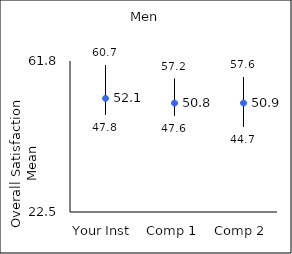
| Category | 25th percentile | 75th percentile | Mean |
|---|---|---|---|
| Your Inst | 47.8 | 60.7 | 52.07 |
| Comp 1 | 47.6 | 57.2 | 50.84 |
| Comp 2 | 44.7 | 57.6 | 50.86 |